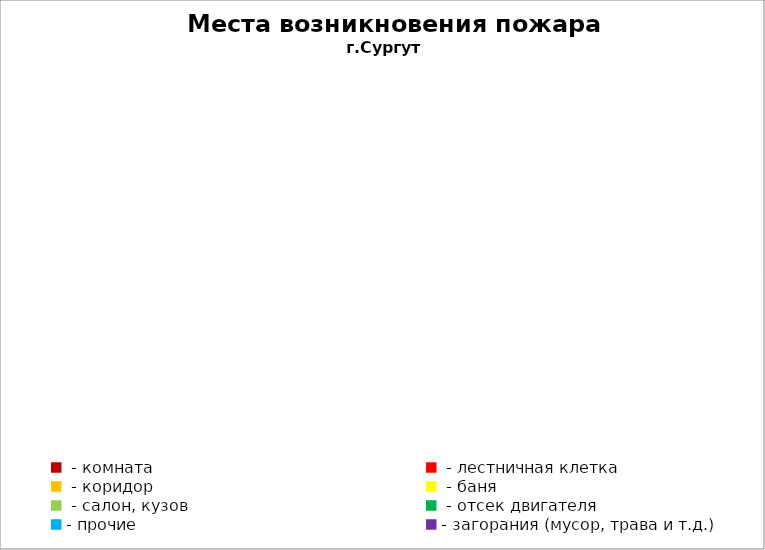
| Category | Места возникновения пожара |
|---|---|
|  - комната | 45 |
|  - лестничная клетка | 11 |
|  - коридор | 6 |
|  - баня | 17 |
|  - салон, кузов | 8 |
|  - отсек двигателя | 16 |
| - прочие | 73 |
| - загорания (мусор, трава и т.д.)  | 136 |